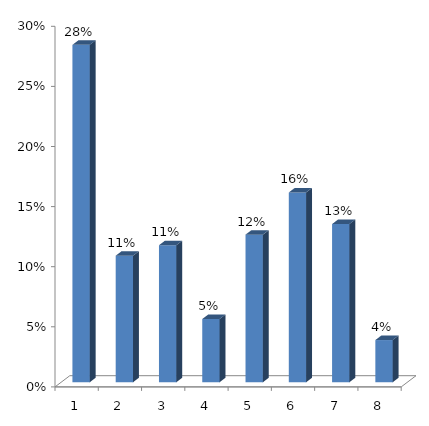
| Category | Series 0 |
|---|---|
| 0 | 0.281 |
| 1 | 0.105 |
| 2 | 0.114 |
| 3 | 0.053 |
| 4 | 0.123 |
| 5 | 0.158 |
| 6 | 0.132 |
| 7 | 0.035 |